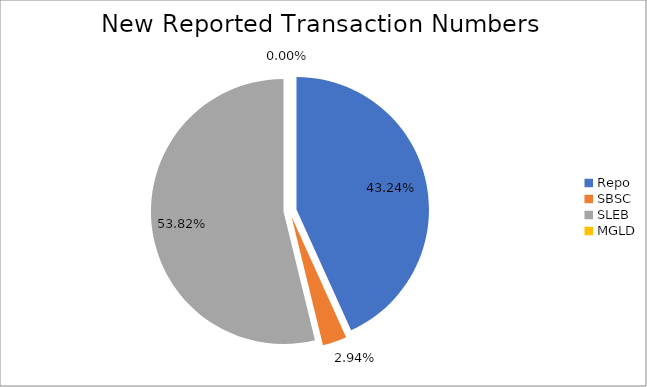
| Category | Series 0 |
|---|---|
| Repo | 469481 |
| SBSC | 31937 |
| SLEB | 584331 |
| MGLD | 17 |